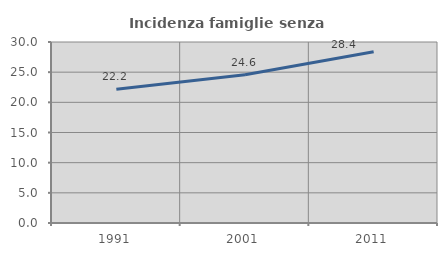
| Category | Incidenza famiglie senza nuclei |
|---|---|
| 1991.0 | 22.174 |
| 2001.0 | 24.582 |
| 2011.0 | 28.383 |